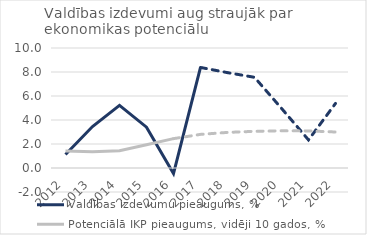
| Category | Valdības izdevumu pieaugums, % | Potenciālā IKP pieaugums, vidēji 10 gados, % |
|---|---|---|
| 2012 | 1.127 | 1.41 |
| 2013 | 3.456 | 1.359 |
| 2014 | 5.221 | 1.439 |
| 2015 | 3.403 | 1.938 |
| 2016 | -0.463 | 2.446 |
| 2017 | 8.379 | 2.802 |
| 2018 | 7.948 | 2.966 |
| 2019 | 7.558 | 3.055 |
| 2020 | 4.971 | 3.1 |
| 2021 | 2.34 | 3.091 |
| 2022 | 5.38 | 3 |